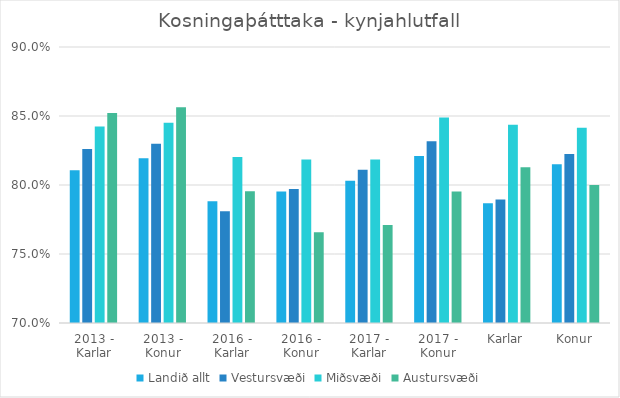
| Category | Landið allt | Vestursvæði | Miðsvæði | Austursvæði |
|---|---|---|---|---|
| 2013 - Karlar | 0.811 | 0.826 | 0.842 | 0.852 |
| 2013 - Konur | 0.819 | 0.83 | 0.845 | 0.856 |
| 2016 - Karlar | 0.788 | 0.781 | 0.82 | 0.796 |
| 2016 - Konur | 0.795 | 0.797 | 0.819 | 0.766 |
| 2017 - Karlar | 0.803 | 0.811 | 0.818 | 0.771 |
| 2017 - Konur | 0.821 | 0.832 | 0.849 | 0.795 |
| Karlar | 0.787 | 0.789 | 0.844 | 0.813 |
| Konur | 0.815 | 0.822 | 0.842 | 0.8 |